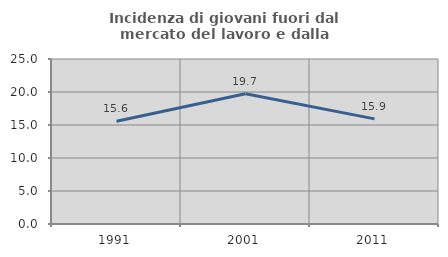
| Category | Incidenza di giovani fuori dal mercato del lavoro e dalla formazione  |
|---|---|
| 1991.0 | 15.567 |
| 2001.0 | 19.745 |
| 2011.0 | 15.924 |